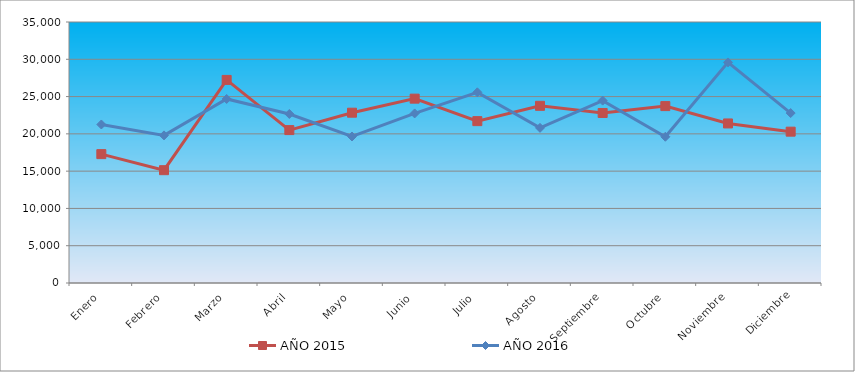
| Category | AÑO 2015 | AÑO 2016 |
|---|---|---|
| Enero | 17281.758 | 21254.887 |
| Febrero | 15128.251 | 19796.365 |
| Marzo | 27232.739 | 24679.044 |
| Abril | 20504.877 | 22667.261 |
| Mayo | 22837.068 | 19647.606 |
| Junio | 24721.184 | 22739.685 |
| Julio | 21705.566 | 25569.379 |
| Agosto | 23760.177 | 20805.084 |
| Septiembre | 22800 | 24459.192 |
| Octubre | 23722.819 | 19610.828 |
| Noviembre | 21395.425 | 29582.562 |
| Diciembre | 20294.947 | 22786.719 |